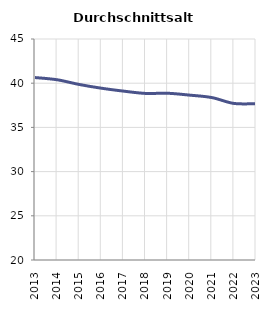
| Category | Durchschnittsalter |
|---|---|
| 2013.0 | 40.639 |
| 2014.0 | 40.39 |
| 2015.0 | 39.857 |
| 2016.0 | 39.434 |
| 2017.0 | 39.106 |
| 2018.0 | 38.843 |
| 2019.0 | 38.863 |
| 2020.0 | 38.65 |
| 2021.0 | 38.377 |
| 2022.0 | 37.71 |
| 2023.0 | 37.687 |